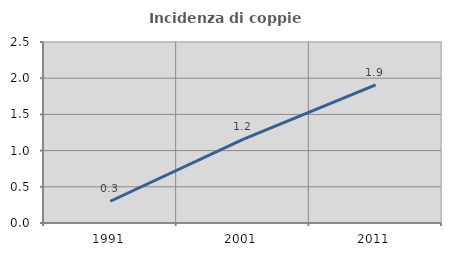
| Category | Incidenza di coppie miste |
|---|---|
| 1991.0 | 0.301 |
| 2001.0 | 1.154 |
| 2011.0 | 1.907 |